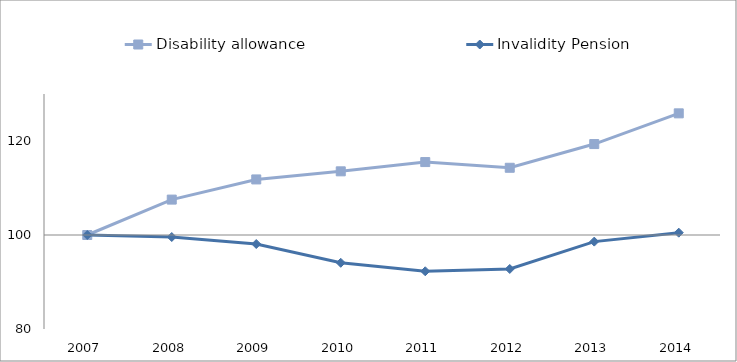
| Category | Disability allowance  | Invalidity Pension | 0 |
|---|---|---|---|
| 2007.0 | 100 | 100 |  |
| 2008.0 | 107.531 | 99.572 |  |
| 2009.0 | 111.823 | 98.084 |  |
| 2010.0 | 113.547 | 94.088 |  |
| 2011.0 | 115.517 | 92.283 |  |
| 2012.0 | 114.302 | 92.766 |  |
| 2013.0 | 119.35 | 98.591 |  |
| 2014.0 | 125.884 | 100.495 |  |